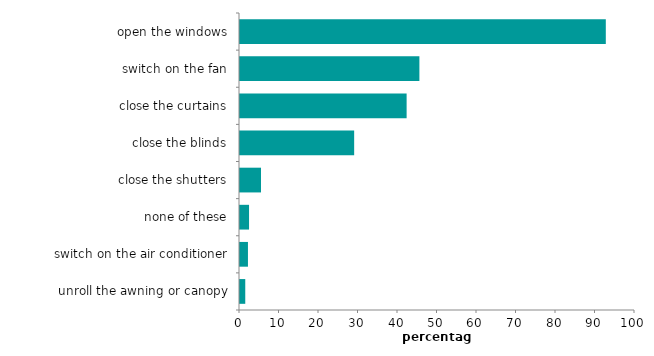
| Category | Series 0 |
|---|---|
| unroll the awning or canopy | 1.332 |
| switch on the air conditioner | 2.014 |
| none of these | 2.291 |
| close the shutters | 5.318 |
| close the blinds | 28.901 |
| close the curtains | 42.183 |
| switch on the fan | 45.415 |
| open the windows | 92.609 |